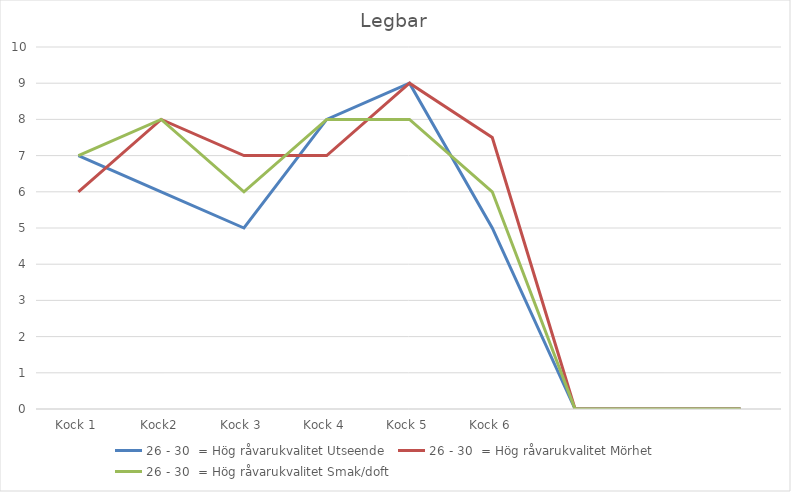
| Category | 26 - 30  = Hög råvarukvalitet Utseende | 26 - 30  = Hög råvarukvalitet Mörhet | 26 - 30  = Hög råvarukvalitet Smak/doft |
|---|---|---|---|
| Kock 1 | 7 | 6 | 7 |
| Kock2 | 6 | 8 | 8 |
| Kock 3 | 5 | 7 | 6 |
| Kock 4 | 8 | 7 | 8 |
| Kock 5 | 9 | 9 | 8 |
| Kock 6 | 5 | 7.5 | 6 |